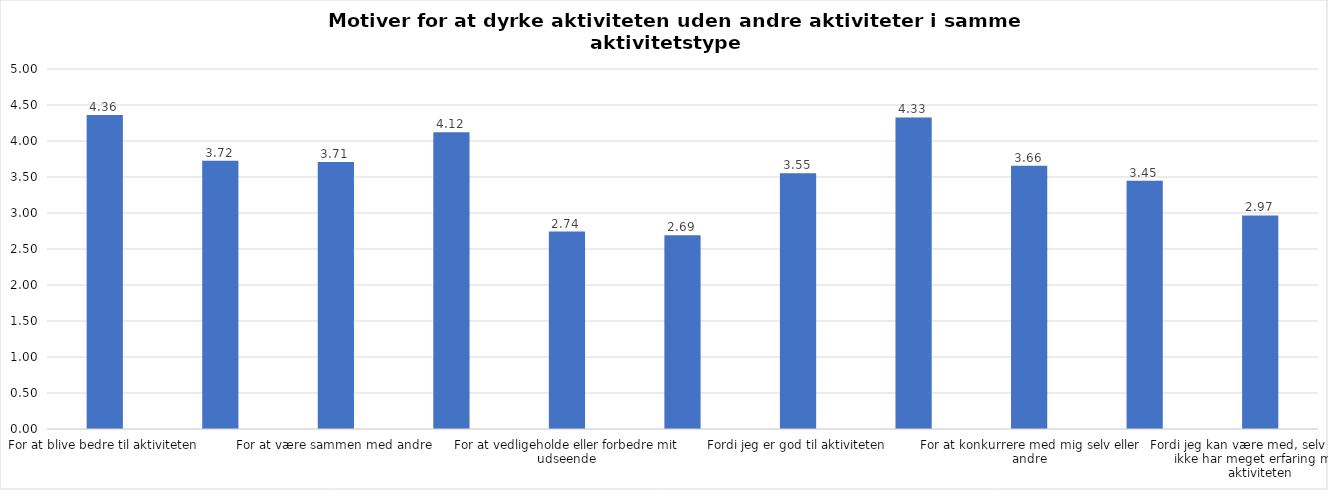
| Category | Gennemsnit |
|---|---|
| For at blive bedre til aktiviteten | 4.362 |
| For at vedligeholde eller forbedre min sundhed (fx helbred, fysisk form) | 3.724 |
| For at være sammen med andre | 3.707 |
| For at gøre noget godt for mig selv | 4.121 |
| For at vedligeholde eller forbedre mit udseende | 2.741 |
| Fordi andre i min omgangskreds opmuntrer mig til det | 2.69 |
| Fordi jeg er god til aktiviteten | 3.552 |
| Fordi jeg godt kan lide aktiviteten | 4.328 |
| For at konkurrere med mig selv eller andre | 3.655 |
| Fordi aktiviteten passer godt ind i min hverdag | 3.448 |
| Fordi jeg kan være med, selv om jeg ikke har meget erfaring med aktiviteten | 2.966 |